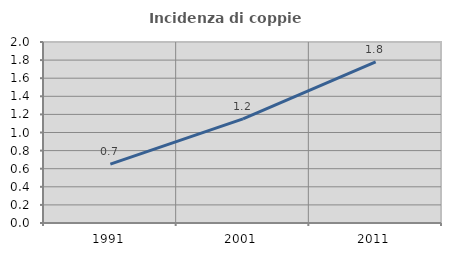
| Category | Incidenza di coppie miste |
|---|---|
| 1991.0 | 0.651 |
| 2001.0 | 1.151 |
| 2011.0 | 1.779 |